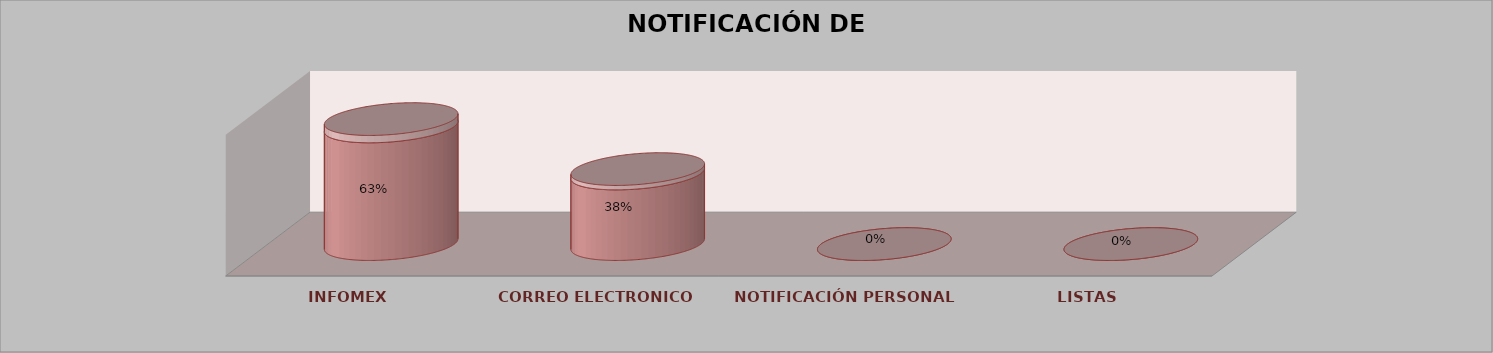
| Category | Series 0 | Series 1 | Series 2 | Series 3 | Series 4 |
|---|---|---|---|---|---|
| INFOMEX |  |  |  | 10 | 0.625 |
| CORREO ELECTRONICO |  |  |  | 6 | 0.375 |
| NOTIFICACIÓN PERSONAL |  |  |  | 0 | 0 |
| LISTAS |  |  |  | 0 | 0 |